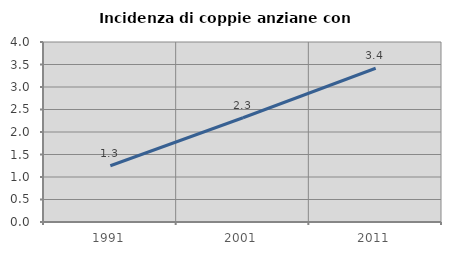
| Category | Incidenza di coppie anziane con figli |
|---|---|
| 1991.0 | 1.25 |
| 2001.0 | 2.317 |
| 2011.0 | 3.416 |